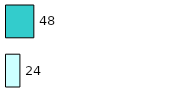
| Category | Series 0 | Series 1 |
|---|---|---|
| 0 | 24 | 48 |